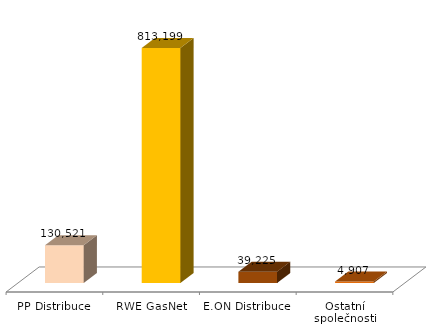
| Category | Series 0 |
|---|---|
| PP Distribuce | 130521.316 |
| RWE GasNet | 813198.856 |
| E.ON Distribuce | 39224.879 |
| Ostatní společnosti | 4907.064 |